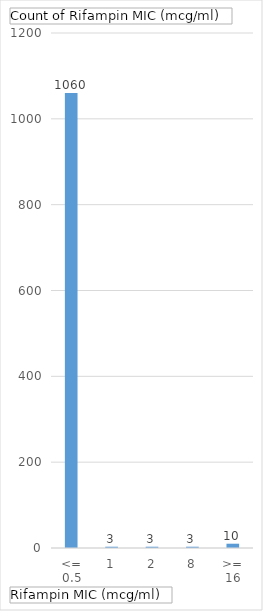
| Category | Total |
|---|---|
| <= 0.5 | 1060 |
| 1 | 3 |
| 2 | 3 |
| 8 | 3 |
| >= 16 | 10 |